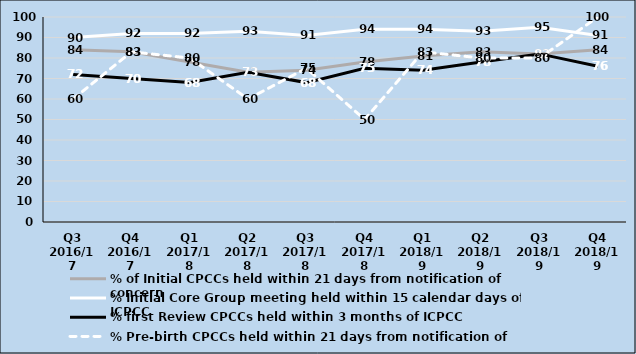
| Category | % of Initial CPCCs held within 21 days from notification of concern | % Initial Core Group meeting held within 15 calendar days of ICPCC | % first Review CPCCs held within 3 months of ICPCC | % Pre-birth CPCCs held within 21 days from notification of concern |
|---|---|---|---|---|
| Q3 2016/17 | 84 | 90 | 72 | 60 |
| Q4 2016/17 | 83 | 92 | 70 | 83 |
| Q1 2017/18 | 78 | 92 | 68 | 80 |
| Q2 2017/18 | 73 | 93 | 73 | 60 |
| Q3 2017/18 | 74 | 91 | 68 | 75 |
| Q4 2017/18 | 78 | 94 | 75 | 50 |
| Q1 2018/19 | 81 | 94 | 74 | 83 |
| Q2 2018/19 | 83 | 93 | 78 | 80 |
| Q3 2018/19 | 82 | 95 | 82 | 80 |
| Q4 2018/19 | 84 | 91 | 76 | 100 |